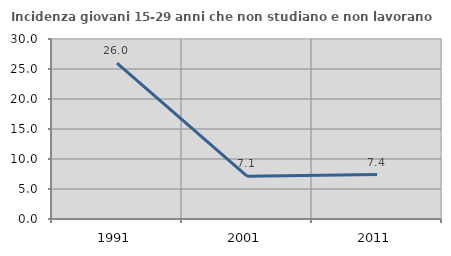
| Category | Incidenza giovani 15-29 anni che non studiano e non lavorano  |
|---|---|
| 1991.0 | 25.974 |
| 2001.0 | 7.143 |
| 2011.0 | 7.407 |